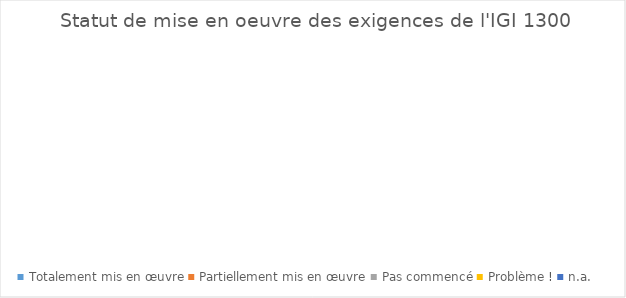
| Category | Series 0 |
|---|---|
| Totalement mis en œuvre | 0 |
| Partiellement mis en œuvre | 0 |
| Pas commencé | 0 |
| Problème ! | 0 |
| n.a. | 0 |